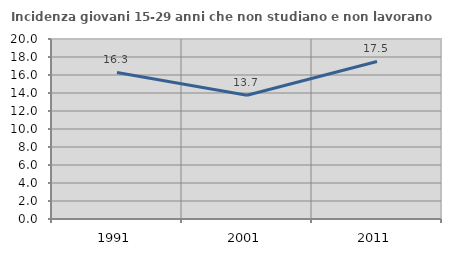
| Category | Incidenza giovani 15-29 anni che non studiano e non lavorano  |
|---|---|
| 1991.0 | 16.279 |
| 2001.0 | 13.742 |
| 2011.0 | 17.507 |